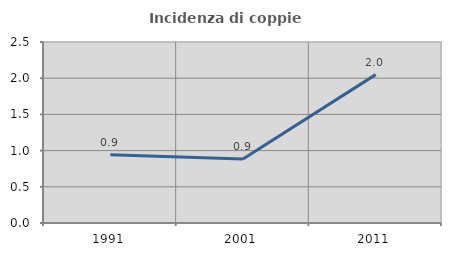
| Category | Incidenza di coppie miste |
|---|---|
| 1991.0 | 0.943 |
| 2001.0 | 0.885 |
| 2011.0 | 2.049 |